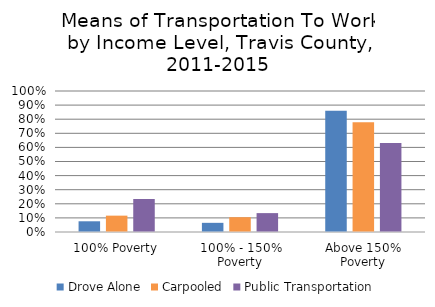
| Category | Drove Alone | Carpooled | Public Transportation |
|---|---|---|---|
| 100% Poverty | 0.076 | 0.116 | 0.234 |
| 100% - 150% Poverty | 0.065 | 0.105 | 0.134 |
| Above 150% Poverty | 0.86 | 0.779 | 0.632 |